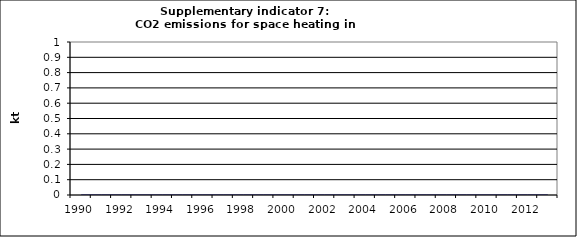
| Category | CO2 emissions for space heating in households, kt |
|---|---|
| 1990 | 0 |
| 1991 | 0 |
| 1992 | 0 |
| 1993 | 0 |
| 1994 | 0 |
| 1995 | 0 |
| 1996 | 0 |
| 1997 | 0 |
| 1998 | 0 |
| 1999 | 0 |
| 2000 | 0 |
| 2001 | 0 |
| 2002 | 0 |
| 2003 | 0 |
| 2004 | 0 |
| 2005 | 0 |
| 2006 | 0 |
| 2007 | 0 |
| 2008 | 0 |
| 2009 | 0 |
| 2010 | 0 |
| 2011 | 0 |
| 2012 | 0 |
| 2013 | 0 |